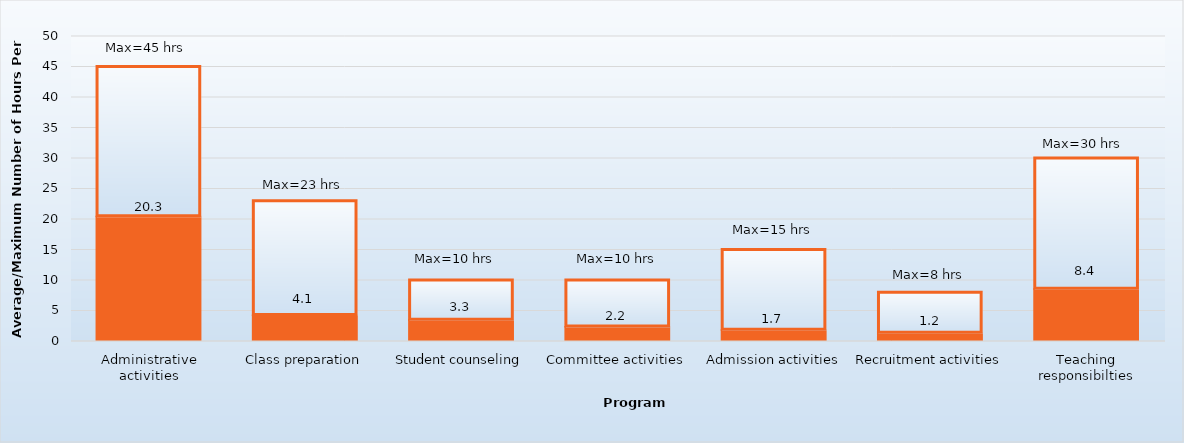
| Category | Average hours per week | Maximum |
|---|---|---|
| Administrative activities | 20.3 | 24.7 |
| Class preparation | 4.1 | 18.9 |
| Student counseling | 3.3 | 6.7 |
| Committee activities | 2.2 | 7.8 |
| Admission activities | 1.7 | 13.3 |
| Recruitment activities | 1.2 | 6.8 |
| Teaching responsibilties | 8.4 | 21.6 |